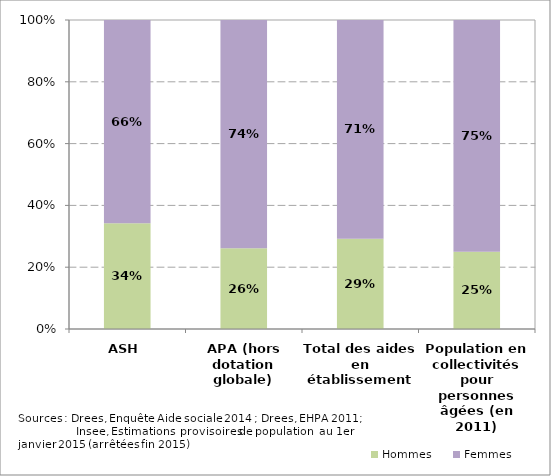
| Category | Hommes | Femmes |
|---|---|---|
| ASH | 0.342 | 0.658 |
| APA (hors dotation globale) | 0.261 | 0.739 |
| Total des aides en établissement | 0.292 | 0.708 |
| Population en collectivités pour personnes âgées (en 2011) | 0.25 | 0.75 |